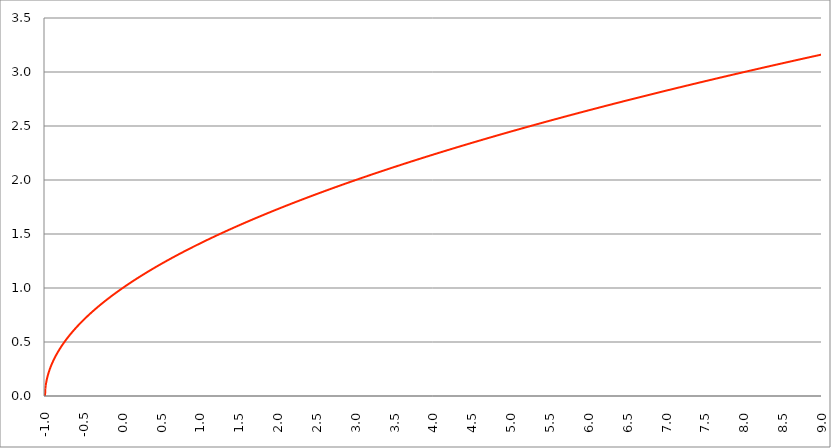
| Category | Series 1 |
|---|---|
| -1.0 | 0 |
| -0.995 | 0.071 |
| -0.99 | 0.1 |
| -0.985 | 0.122 |
| -0.98 | 0.141 |
| -0.975 | 0.158 |
| -0.97 | 0.173 |
| -0.965 | 0.187 |
| -0.96 | 0.2 |
| -0.955 | 0.212 |
| -0.95 | 0.224 |
| -0.945 | 0.235 |
| -0.94 | 0.245 |
| -0.935 | 0.255 |
| -0.93 | 0.265 |
| -0.925 | 0.274 |
| -0.92 | 0.283 |
| -0.915 | 0.292 |
| -0.91 | 0.3 |
| -0.905 | 0.308 |
| -0.9 | 0.316 |
| -0.895 | 0.324 |
| -0.89 | 0.332 |
| -0.885 | 0.339 |
| -0.88 | 0.346 |
| -0.875 | 0.354 |
| -0.87 | 0.361 |
| -0.865 | 0.367 |
| -0.86 | 0.374 |
| -0.855 | 0.381 |
| -0.85 | 0.387 |
| -0.845 | 0.394 |
| -0.84 | 0.4 |
| -0.835 | 0.406 |
| -0.83 | 0.412 |
| -0.825 | 0.418 |
| -0.82 | 0.424 |
| -0.815 | 0.43 |
| -0.81 | 0.436 |
| -0.805 | 0.442 |
| -0.8 | 0.447 |
| -0.795 | 0.453 |
| -0.79 | 0.458 |
| -0.785 | 0.464 |
| -0.78 | 0.469 |
| -0.775 | 0.474 |
| -0.77 | 0.48 |
| -0.765 | 0.485 |
| -0.76 | 0.49 |
| -0.755 | 0.495 |
| -0.75 | 0.5 |
| -0.745 | 0.505 |
| -0.74 | 0.51 |
| -0.735 | 0.515 |
| -0.73 | 0.52 |
| -0.725 | 0.524 |
| -0.72 | 0.529 |
| -0.715 | 0.534 |
| -0.71 | 0.539 |
| -0.705 | 0.543 |
| -0.7 | 0.548 |
| -0.695 | 0.552 |
| -0.69 | 0.557 |
| -0.685 | 0.561 |
| -0.68 | 0.566 |
| -0.675 | 0.57 |
| -0.67 | 0.574 |
| -0.665 | 0.579 |
| -0.66 | 0.583 |
| -0.655 | 0.587 |
| -0.65 | 0.592 |
| -0.645 | 0.596 |
| -0.64 | 0.6 |
| -0.635 | 0.604 |
| -0.63 | 0.608 |
| -0.625 | 0.612 |
| -0.62 | 0.616 |
| -0.615 | 0.62 |
| -0.61 | 0.624 |
| -0.605 | 0.628 |
| -0.6 | 0.632 |
| -0.595 | 0.636 |
| -0.59 | 0.64 |
| -0.585 | 0.644 |
| -0.58 | 0.648 |
| -0.575 | 0.652 |
| -0.57 | 0.656 |
| -0.565 | 0.66 |
| -0.56 | 0.663 |
| -0.555 | 0.667 |
| -0.55 | 0.671 |
| -0.545 | 0.675 |
| -0.54 | 0.678 |
| -0.535 | 0.682 |
| -0.53 | 0.686 |
| -0.525 | 0.689 |
| -0.52 | 0.693 |
| -0.515 | 0.696 |
| -0.51 | 0.7 |
| -0.505 | 0.704 |
| -0.5 | 0.707 |
| -0.495 | 0.711 |
| -0.49 | 0.714 |
| -0.485 | 0.718 |
| -0.48 | 0.721 |
| -0.475 | 0.725 |
| -0.469999999999999 | 0.728 |
| -0.464999999999999 | 0.731 |
| -0.459999999999999 | 0.735 |
| -0.454999999999999 | 0.738 |
| -0.449999999999999 | 0.742 |
| -0.444999999999999 | 0.745 |
| -0.439999999999999 | 0.748 |
| -0.434999999999999 | 0.752 |
| -0.429999999999999 | 0.755 |
| -0.424999999999999 | 0.758 |
| -0.419999999999999 | 0.762 |
| -0.414999999999999 | 0.765 |
| -0.409999999999999 | 0.768 |
| -0.404999999999999 | 0.771 |
| -0.399999999999999 | 0.775 |
| -0.394999999999999 | 0.778 |
| -0.389999999999999 | 0.781 |
| -0.384999999999999 | 0.784 |
| -0.379999999999999 | 0.787 |
| -0.374999999999999 | 0.791 |
| -0.369999999999999 | 0.794 |
| -0.364999999999999 | 0.797 |
| -0.359999999999999 | 0.8 |
| -0.354999999999999 | 0.803 |
| -0.349999999999999 | 0.806 |
| -0.344999999999999 | 0.809 |
| -0.339999999999999 | 0.812 |
| -0.334999999999999 | 0.815 |
| -0.329999999999999 | 0.819 |
| -0.324999999999999 | 0.822 |
| -0.319999999999999 | 0.825 |
| -0.314999999999999 | 0.828 |
| -0.309999999999999 | 0.831 |
| -0.304999999999999 | 0.834 |
| -0.299999999999999 | 0.837 |
| -0.294999999999999 | 0.84 |
| -0.289999999999999 | 0.843 |
| -0.284999999999999 | 0.846 |
| -0.279999999999999 | 0.849 |
| -0.274999999999999 | 0.851 |
| -0.269999999999999 | 0.854 |
| -0.264999999999999 | 0.857 |
| -0.259999999999999 | 0.86 |
| -0.254999999999999 | 0.863 |
| -0.249999999999999 | 0.866 |
| -0.244999999999999 | 0.869 |
| -0.239999999999999 | 0.872 |
| -0.234999999999999 | 0.875 |
| -0.229999999999999 | 0.877 |
| -0.224999999999999 | 0.88 |
| -0.219999999999999 | 0.883 |
| -0.214999999999999 | 0.886 |
| -0.209999999999999 | 0.889 |
| -0.204999999999999 | 0.892 |
| -0.199999999999999 | 0.894 |
| -0.194999999999999 | 0.897 |
| -0.189999999999999 | 0.9 |
| -0.184999999999999 | 0.903 |
| -0.179999999999999 | 0.906 |
| -0.174999999999999 | 0.908 |
| -0.169999999999999 | 0.911 |
| -0.164999999999999 | 0.914 |
| -0.159999999999999 | 0.917 |
| -0.154999999999999 | 0.919 |
| -0.149999999999999 | 0.922 |
| -0.144999999999999 | 0.925 |
| -0.139999999999999 | 0.927 |
| -0.134999999999999 | 0.93 |
| -0.129999999999999 | 0.933 |
| -0.124999999999999 | 0.935 |
| -0.119999999999999 | 0.938 |
| -0.114999999999999 | 0.941 |
| -0.109999999999999 | 0.943 |
| -0.104999999999999 | 0.946 |
| -0.0999999999999992 | 0.949 |
| -0.0949999999999992 | 0.951 |
| -0.0899999999999992 | 0.954 |
| -0.0849999999999992 | 0.957 |
| -0.0799999999999992 | 0.959 |
| -0.0749999999999992 | 0.962 |
| -0.0699999999999992 | 0.964 |
| -0.0649999999999992 | 0.967 |
| -0.0599999999999992 | 0.97 |
| -0.0549999999999992 | 0.972 |
| -0.0499999999999992 | 0.975 |
| -0.0449999999999992 | 0.977 |
| -0.0399999999999992 | 0.98 |
| -0.0349999999999992 | 0.982 |
| -0.0299999999999992 | 0.985 |
| -0.0249999999999992 | 0.987 |
| -0.0199999999999992 | 0.99 |
| -0.0149999999999992 | 0.992 |
| -0.00999999999999918 | 0.995 |
| -0.00499999999999918 | 0.997 |
| 8.2052420413703e-16 | 1 |
| 0.00500000000000082 | 1.002 |
| 0.0100000000000008 | 1.005 |
| 0.0150000000000008 | 1.007 |
| 0.0200000000000008 | 1.01 |
| 0.0250000000000008 | 1.012 |
| 0.0300000000000008 | 1.015 |
| 0.0350000000000008 | 1.017 |
| 0.0400000000000008 | 1.02 |
| 0.0450000000000008 | 1.022 |
| 0.0500000000000008 | 1.025 |
| 0.0550000000000008 | 1.027 |
| 0.0600000000000008 | 1.03 |
| 0.0650000000000008 | 1.032 |
| 0.0700000000000008 | 1.034 |
| 0.0750000000000008 | 1.037 |
| 0.0800000000000008 | 1.039 |
| 0.0850000000000008 | 1.042 |
| 0.0900000000000008 | 1.044 |
| 0.0950000000000008 | 1.046 |
| 0.100000000000001 | 1.049 |
| 0.105000000000001 | 1.051 |
| 0.110000000000001 | 1.054 |
| 0.115000000000001 | 1.056 |
| 0.120000000000001 | 1.058 |
| 0.125000000000001 | 1.061 |
| 0.130000000000001 | 1.063 |
| 0.135000000000001 | 1.065 |
| 0.140000000000001 | 1.068 |
| 0.145000000000001 | 1.07 |
| 0.150000000000001 | 1.072 |
| 0.155000000000001 | 1.075 |
| 0.160000000000001 | 1.077 |
| 0.165000000000001 | 1.079 |
| 0.170000000000001 | 1.082 |
| 0.175000000000001 | 1.084 |
| 0.180000000000001 | 1.086 |
| 0.185000000000001 | 1.089 |
| 0.190000000000001 | 1.091 |
| 0.195000000000001 | 1.093 |
| 0.200000000000001 | 1.095 |
| 0.205000000000001 | 1.098 |
| 0.210000000000001 | 1.1 |
| 0.215000000000001 | 1.102 |
| 0.220000000000001 | 1.105 |
| 0.225000000000001 | 1.107 |
| 0.230000000000001 | 1.109 |
| 0.235000000000001 | 1.111 |
| 0.240000000000001 | 1.114 |
| 0.245000000000001 | 1.116 |
| 0.250000000000001 | 1.118 |
| 0.255000000000001 | 1.12 |
| 0.260000000000001 | 1.122 |
| 0.265000000000001 | 1.125 |
| 0.270000000000001 | 1.127 |
| 0.275000000000001 | 1.129 |
| 0.280000000000001 | 1.131 |
| 0.285000000000001 | 1.134 |
| 0.290000000000001 | 1.136 |
| 0.295000000000001 | 1.138 |
| 0.300000000000001 | 1.14 |
| 0.305000000000001 | 1.142 |
| 0.310000000000001 | 1.145 |
| 0.315000000000001 | 1.147 |
| 0.320000000000001 | 1.149 |
| 0.325000000000001 | 1.151 |
| 0.330000000000001 | 1.153 |
| 0.335000000000001 | 1.155 |
| 0.340000000000001 | 1.158 |
| 0.345000000000001 | 1.16 |
| 0.350000000000001 | 1.162 |
| 0.355000000000001 | 1.164 |
| 0.360000000000001 | 1.166 |
| 0.365000000000001 | 1.168 |
| 0.370000000000001 | 1.17 |
| 0.375000000000001 | 1.173 |
| 0.380000000000001 | 1.175 |
| 0.385000000000001 | 1.177 |
| 0.390000000000001 | 1.179 |
| 0.395000000000001 | 1.181 |
| 0.400000000000001 | 1.183 |
| 0.405000000000001 | 1.185 |
| 0.410000000000001 | 1.187 |
| 0.415000000000001 | 1.19 |
| 0.420000000000001 | 1.192 |
| 0.425000000000001 | 1.194 |
| 0.430000000000001 | 1.196 |
| 0.435000000000001 | 1.198 |
| 0.440000000000001 | 1.2 |
| 0.445000000000001 | 1.202 |
| 0.450000000000001 | 1.204 |
| 0.455000000000001 | 1.206 |
| 0.460000000000001 | 1.208 |
| 0.465000000000001 | 1.21 |
| 0.470000000000001 | 1.212 |
| 0.475000000000001 | 1.214 |
| 0.480000000000001 | 1.217 |
| 0.485000000000001 | 1.219 |
| 0.490000000000001 | 1.221 |
| 0.495000000000001 | 1.223 |
| 0.500000000000001 | 1.225 |
| 0.505000000000001 | 1.227 |
| 0.510000000000001 | 1.229 |
| 0.515000000000001 | 1.231 |
| 0.520000000000001 | 1.233 |
| 0.525000000000001 | 1.235 |
| 0.530000000000001 | 1.237 |
| 0.535000000000001 | 1.239 |
| 0.540000000000001 | 1.241 |
| 0.545000000000001 | 1.243 |
| 0.550000000000001 | 1.245 |
| 0.555000000000001 | 1.247 |
| 0.560000000000001 | 1.249 |
| 0.565000000000001 | 1.251 |
| 0.570000000000001 | 1.253 |
| 0.575000000000001 | 1.255 |
| 0.580000000000001 | 1.257 |
| 0.585000000000001 | 1.259 |
| 0.590000000000001 | 1.261 |
| 0.595000000000001 | 1.263 |
| 0.600000000000001 | 1.265 |
| 0.605000000000001 | 1.267 |
| 0.610000000000001 | 1.269 |
| 0.615000000000001 | 1.271 |
| 0.620000000000001 | 1.273 |
| 0.625000000000001 | 1.275 |
| 0.630000000000001 | 1.277 |
| 0.635000000000001 | 1.279 |
| 0.640000000000001 | 1.281 |
| 0.645000000000001 | 1.283 |
| 0.650000000000001 | 1.285 |
| 0.655000000000001 | 1.286 |
| 0.660000000000001 | 1.288 |
| 0.665000000000001 | 1.29 |
| 0.670000000000001 | 1.292 |
| 0.675000000000001 | 1.294 |
| 0.680000000000001 | 1.296 |
| 0.685000000000001 | 1.298 |
| 0.690000000000001 | 1.3 |
| 0.695000000000001 | 1.302 |
| 0.700000000000001 | 1.304 |
| 0.705000000000001 | 1.306 |
| 0.710000000000001 | 1.308 |
| 0.715000000000001 | 1.31 |
| 0.720000000000001 | 1.311 |
| 0.725000000000001 | 1.313 |
| 0.730000000000001 | 1.315 |
| 0.735000000000001 | 1.317 |
| 0.740000000000001 | 1.319 |
| 0.745000000000001 | 1.321 |
| 0.750000000000001 | 1.323 |
| 0.755000000000001 | 1.325 |
| 0.760000000000001 | 1.327 |
| 0.765000000000001 | 1.329 |
| 0.770000000000001 | 1.33 |
| 0.775000000000001 | 1.332 |
| 0.780000000000001 | 1.334 |
| 0.785000000000001 | 1.336 |
| 0.790000000000001 | 1.338 |
| 0.795000000000001 | 1.34 |
| 0.800000000000001 | 1.342 |
| 0.805000000000001 | 1.344 |
| 0.810000000000001 | 1.345 |
| 0.815000000000001 | 1.347 |
| 0.820000000000001 | 1.349 |
| 0.825000000000001 | 1.351 |
| 0.830000000000001 | 1.353 |
| 0.835000000000001 | 1.355 |
| 0.840000000000001 | 1.356 |
| 0.845000000000001 | 1.358 |
| 0.850000000000001 | 1.36 |
| 0.855000000000001 | 1.362 |
| 0.860000000000001 | 1.364 |
| 0.865000000000001 | 1.366 |
| 0.870000000000001 | 1.367 |
| 0.875000000000001 | 1.369 |
| 0.880000000000001 | 1.371 |
| 0.885000000000001 | 1.373 |
| 0.890000000000001 | 1.375 |
| 0.895000000000001 | 1.377 |
| 0.900000000000001 | 1.378 |
| 0.905000000000001 | 1.38 |
| 0.910000000000001 | 1.382 |
| 0.915000000000001 | 1.384 |
| 0.920000000000001 | 1.386 |
| 0.925000000000001 | 1.387 |
| 0.930000000000001 | 1.389 |
| 0.935000000000001 | 1.391 |
| 0.940000000000001 | 1.393 |
| 0.945000000000001 | 1.395 |
| 0.950000000000001 | 1.396 |
| 0.955000000000001 | 1.398 |
| 0.960000000000001 | 1.4 |
| 0.965000000000001 | 1.402 |
| 0.970000000000001 | 1.404 |
| 0.975000000000002 | 1.405 |
| 0.980000000000001 | 1.407 |
| 0.985000000000002 | 1.409 |
| 0.990000000000001 | 1.411 |
| 0.995000000000002 | 1.412 |
| 1.000000000000002 | 1.414 |
| 1.005000000000001 | 1.416 |
| 1.010000000000001 | 1.418 |
| 1.015000000000001 | 1.42 |
| 1.020000000000001 | 1.421 |
| 1.025000000000001 | 1.423 |
| 1.030000000000001 | 1.425 |
| 1.035000000000001 | 1.427 |
| 1.040000000000001 | 1.428 |
| 1.045000000000001 | 1.43 |
| 1.05 | 1.432 |
| 1.055 | 1.434 |
| 1.06 | 1.435 |
| 1.065 | 1.437 |
| 1.07 | 1.439 |
| 1.075 | 1.44 |
| 1.08 | 1.442 |
| 1.085 | 1.444 |
| 1.09 | 1.446 |
| 1.095 | 1.447 |
| 1.099999999999999 | 1.449 |
| 1.104999999999999 | 1.451 |
| 1.109999999999999 | 1.453 |
| 1.114999999999999 | 1.454 |
| 1.119999999999999 | 1.456 |
| 1.124999999999999 | 1.458 |
| 1.129999999999999 | 1.459 |
| 1.134999999999999 | 1.461 |
| 1.139999999999999 | 1.463 |
| 1.144999999999998 | 1.465 |
| 1.149999999999998 | 1.466 |
| 1.154999999999998 | 1.468 |
| 1.159999999999998 | 1.47 |
| 1.164999999999998 | 1.471 |
| 1.169999999999998 | 1.473 |
| 1.174999999999998 | 1.475 |
| 1.179999999999998 | 1.476 |
| 1.184999999999998 | 1.478 |
| 1.189999999999997 | 1.48 |
| 1.194999999999997 | 1.482 |
| 1.199999999999997 | 1.483 |
| 1.204999999999997 | 1.485 |
| 1.209999999999997 | 1.487 |
| 1.214999999999997 | 1.488 |
| 1.219999999999997 | 1.49 |
| 1.224999999999997 | 1.492 |
| 1.229999999999997 | 1.493 |
| 1.234999999999997 | 1.495 |
| 1.239999999999996 | 1.497 |
| 1.244999999999996 | 1.498 |
| 1.249999999999996 | 1.5 |
| 1.254999999999996 | 1.502 |
| 1.259999999999996 | 1.503 |
| 1.264999999999996 | 1.505 |
| 1.269999999999996 | 1.507 |
| 1.274999999999996 | 1.508 |
| 1.279999999999996 | 1.51 |
| 1.284999999999995 | 1.512 |
| 1.289999999999995 | 1.513 |
| 1.294999999999995 | 1.515 |
| 1.299999999999995 | 1.517 |
| 1.304999999999995 | 1.518 |
| 1.309999999999995 | 1.52 |
| 1.314999999999995 | 1.522 |
| 1.319999999999995 | 1.523 |
| 1.324999999999995 | 1.525 |
| 1.329999999999994 | 1.526 |
| 1.334999999999994 | 1.528 |
| 1.339999999999994 | 1.53 |
| 1.344999999999994 | 1.531 |
| 1.349999999999994 | 1.533 |
| 1.354999999999994 | 1.535 |
| 1.359999999999994 | 1.536 |
| 1.364999999999994 | 1.538 |
| 1.369999999999994 | 1.539 |
| 1.374999999999994 | 1.541 |
| 1.379999999999993 | 1.543 |
| 1.384999999999993 | 1.544 |
| 1.389999999999993 | 1.546 |
| 1.394999999999993 | 1.548 |
| 1.399999999999993 | 1.549 |
| 1.404999999999993 | 1.551 |
| 1.409999999999993 | 1.552 |
| 1.414999999999993 | 1.554 |
| 1.419999999999993 | 1.556 |
| 1.424999999999992 | 1.557 |
| 1.429999999999992 | 1.559 |
| 1.434999999999992 | 1.56 |
| 1.439999999999992 | 1.562 |
| 1.444999999999992 | 1.564 |
| 1.449999999999992 | 1.565 |
| 1.454999999999992 | 1.567 |
| 1.459999999999992 | 1.568 |
| 1.464999999999992 | 1.57 |
| 1.469999999999991 | 1.572 |
| 1.474999999999991 | 1.573 |
| 1.479999999999991 | 1.575 |
| 1.484999999999991 | 1.576 |
| 1.489999999999991 | 1.578 |
| 1.494999999999991 | 1.58 |
| 1.499999999999991 | 1.581 |
| 1.504999999999991 | 1.583 |
| 1.509999999999991 | 1.584 |
| 1.514999999999991 | 1.586 |
| 1.51999999999999 | 1.587 |
| 1.52499999999999 | 1.589 |
| 1.52999999999999 | 1.591 |
| 1.53499999999999 | 1.592 |
| 1.53999999999999 | 1.594 |
| 1.54499999999999 | 1.595 |
| 1.54999999999999 | 1.597 |
| 1.55499999999999 | 1.598 |
| 1.55999999999999 | 1.6 |
| 1.564999999999989 | 1.602 |
| 1.569999999999989 | 1.603 |
| 1.574999999999989 | 1.605 |
| 1.579999999999989 | 1.606 |
| 1.584999999999989 | 1.608 |
| 1.589999999999989 | 1.609 |
| 1.594999999999989 | 1.611 |
| 1.599999999999989 | 1.612 |
| 1.604999999999989 | 1.614 |
| 1.609999999999988 | 1.616 |
| 1.614999999999988 | 1.617 |
| 1.619999999999988 | 1.619 |
| 1.624999999999988 | 1.62 |
| 1.629999999999988 | 1.622 |
| 1.634999999999988 | 1.623 |
| 1.639999999999988 | 1.625 |
| 1.644999999999988 | 1.626 |
| 1.649999999999988 | 1.628 |
| 1.654999999999987 | 1.629 |
| 1.659999999999987 | 1.631 |
| 1.664999999999987 | 1.632 |
| 1.669999999999987 | 1.634 |
| 1.674999999999987 | 1.636 |
| 1.679999999999987 | 1.637 |
| 1.684999999999987 | 1.639 |
| 1.689999999999987 | 1.64 |
| 1.694999999999987 | 1.642 |
| 1.699999999999987 | 1.643 |
| 1.704999999999986 | 1.645 |
| 1.709999999999986 | 1.646 |
| 1.714999999999986 | 1.648 |
| 1.719999999999986 | 1.649 |
| 1.724999999999986 | 1.651 |
| 1.729999999999986 | 1.652 |
| 1.734999999999986 | 1.654 |
| 1.739999999999986 | 1.655 |
| 1.744999999999986 | 1.657 |
| 1.749999999999985 | 1.658 |
| 1.754999999999985 | 1.66 |
| 1.759999999999985 | 1.661 |
| 1.764999999999985 | 1.663 |
| 1.769999999999985 | 1.664 |
| 1.774999999999985 | 1.666 |
| 1.779999999999985 | 1.667 |
| 1.784999999999985 | 1.669 |
| 1.789999999999985 | 1.67 |
| 1.794999999999985 | 1.672 |
| 1.799999999999984 | 1.673 |
| 1.804999999999984 | 1.675 |
| 1.809999999999984 | 1.676 |
| 1.814999999999984 | 1.678 |
| 1.819999999999984 | 1.679 |
| 1.824999999999984 | 1.681 |
| 1.829999999999984 | 1.682 |
| 1.834999999999984 | 1.684 |
| 1.839999999999984 | 1.685 |
| 1.844999999999983 | 1.687 |
| 1.849999999999983 | 1.688 |
| 1.854999999999983 | 1.69 |
| 1.859999999999983 | 1.691 |
| 1.864999999999983 | 1.693 |
| 1.869999999999983 | 1.694 |
| 1.874999999999983 | 1.696 |
| 1.879999999999983 | 1.697 |
| 1.884999999999983 | 1.699 |
| 1.889999999999983 | 1.7 |
| 1.894999999999982 | 1.701 |
| 1.899999999999982 | 1.703 |
| 1.904999999999982 | 1.704 |
| 1.909999999999982 | 1.706 |
| 1.914999999999982 | 1.707 |
| 1.919999999999982 | 1.709 |
| 1.924999999999982 | 1.71 |
| 1.929999999999982 | 1.712 |
| 1.934999999999982 | 1.713 |
| 1.939999999999981 | 1.715 |
| 1.944999999999981 | 1.716 |
| 1.949999999999981 | 1.718 |
| 1.954999999999981 | 1.719 |
| 1.959999999999981 | 1.72 |
| 1.964999999999981 | 1.722 |
| 1.969999999999981 | 1.723 |
| 1.974999999999981 | 1.725 |
| 1.979999999999981 | 1.726 |
| 1.984999999999981 | 1.728 |
| 1.98999999999998 | 1.729 |
| 1.99499999999998 | 1.731 |
| 1.99999999999998 | 1.732 |
| 2.00499999999998 | 1.733 |
| 2.00999999999998 | 1.735 |
| 2.01499999999998 | 1.736 |
| 2.01999999999998 | 1.738 |
| 2.02499999999998 | 1.739 |
| 2.02999999999998 | 1.741 |
| 2.03499999999998 | 1.742 |
| 2.03999999999998 | 1.744 |
| 2.044999999999979 | 1.745 |
| 2.049999999999979 | 1.746 |
| 2.054999999999979 | 1.748 |
| 2.059999999999979 | 1.749 |
| 2.06499999999998 | 1.751 |
| 2.069999999999979 | 1.752 |
| 2.074999999999979 | 1.754 |
| 2.079999999999979 | 1.755 |
| 2.084999999999979 | 1.756 |
| 2.089999999999979 | 1.758 |
| 2.094999999999978 | 1.759 |
| 2.099999999999978 | 1.761 |
| 2.104999999999978 | 1.762 |
| 2.109999999999978 | 1.764 |
| 2.114999999999978 | 1.765 |
| 2.119999999999978 | 1.766 |
| 2.124999999999978 | 1.768 |
| 2.129999999999978 | 1.769 |
| 2.134999999999978 | 1.771 |
| 2.139999999999977 | 1.772 |
| 2.144999999999977 | 1.773 |
| 2.149999999999977 | 1.775 |
| 2.154999999999977 | 1.776 |
| 2.159999999999977 | 1.778 |
| 2.164999999999977 | 1.779 |
| 2.169999999999977 | 1.78 |
| 2.174999999999977 | 1.782 |
| 2.179999999999977 | 1.783 |
| 2.184999999999976 | 1.785 |
| 2.189999999999976 | 1.786 |
| 2.194999999999976 | 1.787 |
| 2.199999999999976 | 1.789 |
| 2.204999999999976 | 1.79 |
| 2.209999999999976 | 1.792 |
| 2.214999999999976 | 1.793 |
| 2.219999999999976 | 1.794 |
| 2.224999999999976 | 1.796 |
| 2.229999999999976 | 1.797 |
| 2.234999999999975 | 1.799 |
| 2.239999999999975 | 1.8 |
| 2.244999999999975 | 1.801 |
| 2.249999999999975 | 1.803 |
| 2.254999999999975 | 1.804 |
| 2.259999999999975 | 1.806 |
| 2.264999999999975 | 1.807 |
| 2.269999999999975 | 1.808 |
| 2.274999999999975 | 1.81 |
| 2.279999999999974 | 1.811 |
| 2.284999999999974 | 1.812 |
| 2.289999999999974 | 1.814 |
| 2.294999999999974 | 1.815 |
| 2.299999999999974 | 1.817 |
| 2.304999999999974 | 1.818 |
| 2.309999999999974 | 1.819 |
| 2.314999999999974 | 1.821 |
| 2.319999999999974 | 1.822 |
| 2.324999999999973 | 1.823 |
| 2.329999999999973 | 1.825 |
| 2.334999999999973 | 1.826 |
| 2.339999999999973 | 1.828 |
| 2.344999999999973 | 1.829 |
| 2.349999999999973 | 1.83 |
| 2.354999999999973 | 1.832 |
| 2.359999999999973 | 1.833 |
| 2.364999999999973 | 1.834 |
| 2.369999999999973 | 1.836 |
| 2.374999999999972 | 1.837 |
| 2.379999999999972 | 1.838 |
| 2.384999999999972 | 1.84 |
| 2.389999999999972 | 1.841 |
| 2.394999999999972 | 1.843 |
| 2.399999999999972 | 1.844 |
| 2.404999999999972 | 1.845 |
| 2.409999999999972 | 1.847 |
| 2.414999999999972 | 1.848 |
| 2.419999999999971 | 1.849 |
| 2.424999999999971 | 1.851 |
| 2.429999999999971 | 1.852 |
| 2.434999999999971 | 1.853 |
| 2.439999999999971 | 1.855 |
| 2.444999999999971 | 1.856 |
| 2.449999999999971 | 1.857 |
| 2.454999999999971 | 1.859 |
| 2.459999999999971 | 1.86 |
| 2.464999999999971 | 1.861 |
| 2.46999999999997 | 1.863 |
| 2.47499999999997 | 1.864 |
| 2.47999999999997 | 1.865 |
| 2.48499999999997 | 1.867 |
| 2.48999999999997 | 1.868 |
| 2.49499999999997 | 1.869 |
| 2.49999999999997 | 1.871 |
| 2.50499999999997 | 1.872 |
| 2.50999999999997 | 1.873 |
| 2.514999999999969 | 1.875 |
| 2.519999999999969 | 1.876 |
| 2.524999999999969 | 1.877 |
| 2.529999999999969 | 1.879 |
| 2.534999999999969 | 1.88 |
| 2.539999999999969 | 1.881 |
| 2.544999999999969 | 1.883 |
| 2.549999999999969 | 1.884 |
| 2.554999999999969 | 1.885 |
| 2.559999999999969 | 1.887 |
| 2.564999999999968 | 1.888 |
| 2.569999999999968 | 1.889 |
| 2.574999999999968 | 1.891 |
| 2.579999999999968 | 1.892 |
| 2.584999999999968 | 1.893 |
| 2.589999999999968 | 1.895 |
| 2.594999999999968 | 1.896 |
| 2.599999999999968 | 1.897 |
| 2.604999999999967 | 1.899 |
| 2.609999999999967 | 1.9 |
| 2.614999999999967 | 1.901 |
| 2.619999999999967 | 1.903 |
| 2.624999999999967 | 1.904 |
| 2.629999999999967 | 1.905 |
| 2.634999999999967 | 1.907 |
| 2.639999999999967 | 1.908 |
| 2.644999999999967 | 1.909 |
| 2.649999999999967 | 1.91 |
| 2.654999999999966 | 1.912 |
| 2.659999999999966 | 1.913 |
| 2.664999999999966 | 1.914 |
| 2.669999999999966 | 1.916 |
| 2.674999999999966 | 1.917 |
| 2.679999999999966 | 1.918 |
| 2.684999999999966 | 1.92 |
| 2.689999999999966 | 1.921 |
| 2.694999999999966 | 1.922 |
| 2.699999999999965 | 1.924 |
| 2.704999999999965 | 1.925 |
| 2.709999999999965 | 1.926 |
| 2.714999999999965 | 1.927 |
| 2.719999999999965 | 1.929 |
| 2.724999999999965 | 1.93 |
| 2.729999999999965 | 1.931 |
| 2.734999999999965 | 1.933 |
| 2.739999999999965 | 1.934 |
| 2.744999999999965 | 1.935 |
| 2.749999999999964 | 1.936 |
| 2.754999999999964 | 1.938 |
| 2.759999999999964 | 1.939 |
| 2.764999999999964 | 1.94 |
| 2.769999999999964 | 1.942 |
| 2.774999999999964 | 1.943 |
| 2.779999999999964 | 1.944 |
| 2.784999999999964 | 1.946 |
| 2.789999999999964 | 1.947 |
| 2.794999999999963 | 1.948 |
| 2.799999999999963 | 1.949 |
| 2.804999999999963 | 1.951 |
| 2.809999999999963 | 1.952 |
| 2.814999999999963 | 1.953 |
| 2.819999999999963 | 1.954 |
| 2.824999999999963 | 1.956 |
| 2.829999999999963 | 1.957 |
| 2.834999999999963 | 1.958 |
| 2.839999999999963 | 1.96 |
| 2.844999999999962 | 1.961 |
| 2.849999999999962 | 1.962 |
| 2.854999999999962 | 1.963 |
| 2.859999999999962 | 1.965 |
| 2.864999999999962 | 1.966 |
| 2.869999999999962 | 1.967 |
| 2.874999999999962 | 1.969 |
| 2.879999999999962 | 1.97 |
| 2.884999999999962 | 1.971 |
| 2.889999999999961 | 1.972 |
| 2.894999999999961 | 1.974 |
| 2.899999999999961 | 1.975 |
| 2.904999999999961 | 1.976 |
| 2.909999999999961 | 1.977 |
| 2.914999999999961 | 1.979 |
| 2.919999999999961 | 1.98 |
| 2.924999999999961 | 1.981 |
| 2.929999999999961 | 1.982 |
| 2.934999999999961 | 1.984 |
| 2.93999999999996 | 1.985 |
| 2.94499999999996 | 1.986 |
| 2.94999999999996 | 1.987 |
| 2.95499999999996 | 1.989 |
| 2.95999999999996 | 1.99 |
| 2.96499999999996 | 1.991 |
| 2.96999999999996 | 1.992 |
| 2.97499999999996 | 1.994 |
| 2.97999999999996 | 1.995 |
| 2.984999999999959 | 1.996 |
| 2.989999999999959 | 1.997 |
| 2.994999999999959 | 1.999 |
| 2.999999999999959 | 2 |
| 3.00499999999996 | 2.001 |
| 3.009999999999959 | 2.002 |
| 3.014999999999959 | 2.004 |
| 3.019999999999959 | 2.005 |
| 3.024999999999959 | 2.006 |
| 3.029999999999958 | 2.007 |
| 3.034999999999958 | 2.009 |
| 3.039999999999958 | 2.01 |
| 3.044999999999958 | 2.011 |
| 3.049999999999958 | 2.012 |
| 3.054999999999958 | 2.014 |
| 3.059999999999958 | 2.015 |
| 3.064999999999958 | 2.016 |
| 3.069999999999958 | 2.017 |
| 3.074999999999958 | 2.019 |
| 3.079999999999957 | 2.02 |
| 3.084999999999957 | 2.021 |
| 3.089999999999957 | 2.022 |
| 3.094999999999957 | 2.024 |
| 3.099999999999957 | 2.025 |
| 3.104999999999957 | 2.026 |
| 3.109999999999957 | 2.027 |
| 3.114999999999957 | 2.029 |
| 3.119999999999957 | 2.03 |
| 3.124999999999956 | 2.031 |
| 3.129999999999956 | 2.032 |
| 3.134999999999956 | 2.033 |
| 3.139999999999956 | 2.035 |
| 3.144999999999956 | 2.036 |
| 3.149999999999956 | 2.037 |
| 3.154999999999956 | 2.038 |
| 3.159999999999956 | 2.04 |
| 3.164999999999956 | 2.041 |
| 3.169999999999955 | 2.042 |
| 3.174999999999955 | 2.043 |
| 3.179999999999955 | 2.045 |
| 3.184999999999955 | 2.046 |
| 3.189999999999955 | 2.047 |
| 3.194999999999955 | 2.048 |
| 3.199999999999955 | 2.049 |
| 3.204999999999955 | 2.051 |
| 3.209999999999955 | 2.052 |
| 3.214999999999955 | 2.053 |
| 3.219999999999954 | 2.054 |
| 3.224999999999954 | 2.055 |
| 3.229999999999954 | 2.057 |
| 3.234999999999954 | 2.058 |
| 3.239999999999954 | 2.059 |
| 3.244999999999954 | 2.06 |
| 3.249999999999954 | 2.062 |
| 3.254999999999954 | 2.063 |
| 3.259999999999954 | 2.064 |
| 3.264999999999953 | 2.065 |
| 3.269999999999953 | 2.066 |
| 3.274999999999953 | 2.068 |
| 3.279999999999953 | 2.069 |
| 3.284999999999953 | 2.07 |
| 3.289999999999953 | 2.071 |
| 3.294999999999953 | 2.072 |
| 3.299999999999953 | 2.074 |
| 3.304999999999953 | 2.075 |
| 3.309999999999952 | 2.076 |
| 3.314999999999952 | 2.077 |
| 3.319999999999952 | 2.078 |
| 3.324999999999952 | 2.08 |
| 3.329999999999952 | 2.081 |
| 3.334999999999952 | 2.082 |
| 3.339999999999952 | 2.083 |
| 3.344999999999952 | 2.084 |
| 3.349999999999952 | 2.086 |
| 3.354999999999952 | 2.087 |
| 3.359999999999951 | 2.088 |
| 3.364999999999951 | 2.089 |
| 3.369999999999951 | 2.09 |
| 3.374999999999951 | 2.092 |
| 3.379999999999951 | 2.093 |
| 3.384999999999951 | 2.094 |
| 3.389999999999951 | 2.095 |
| 3.394999999999951 | 2.096 |
| 3.399999999999951 | 2.098 |
| 3.40499999999995 | 2.099 |
| 3.40999999999995 | 2.1 |
| 3.41499999999995 | 2.101 |
| 3.41999999999995 | 2.102 |
| 3.42499999999995 | 2.104 |
| 3.42999999999995 | 2.105 |
| 3.43499999999995 | 2.106 |
| 3.43999999999995 | 2.107 |
| 3.44499999999995 | 2.108 |
| 3.44999999999995 | 2.11 |
| 3.454999999999949 | 2.111 |
| 3.459999999999949 | 2.112 |
| 3.464999999999949 | 2.113 |
| 3.469999999999949 | 2.114 |
| 3.474999999999949 | 2.115 |
| 3.479999999999949 | 2.117 |
| 3.484999999999949 | 2.118 |
| 3.489999999999949 | 2.119 |
| 3.494999999999949 | 2.12 |
| 3.499999999999948 | 2.121 |
| 3.504999999999948 | 2.122 |
| 3.509999999999948 | 2.124 |
| 3.514999999999948 | 2.125 |
| 3.519999999999948 | 2.126 |
| 3.524999999999948 | 2.127 |
| 3.529999999999948 | 2.128 |
| 3.534999999999948 | 2.13 |
| 3.539999999999948 | 2.131 |
| 3.544999999999948 | 2.132 |
| 3.549999999999947 | 2.133 |
| 3.554999999999947 | 2.134 |
| 3.559999999999947 | 2.135 |
| 3.564999999999947 | 2.137 |
| 3.569999999999947 | 2.138 |
| 3.574999999999947 | 2.139 |
| 3.579999999999947 | 2.14 |
| 3.584999999999947 | 2.141 |
| 3.589999999999947 | 2.142 |
| 3.594999999999946 | 2.144 |
| 3.599999999999946 | 2.145 |
| 3.604999999999946 | 2.146 |
| 3.609999999999946 | 2.147 |
| 3.614999999999946 | 2.148 |
| 3.619999999999946 | 2.149 |
| 3.624999999999946 | 2.151 |
| 3.629999999999946 | 2.152 |
| 3.634999999999946 | 2.153 |
| 3.639999999999945 | 2.154 |
| 3.644999999999945 | 2.155 |
| 3.649999999999945 | 2.156 |
| 3.654999999999945 | 2.158 |
| 3.659999999999945 | 2.159 |
| 3.664999999999945 | 2.16 |
| 3.669999999999945 | 2.161 |
| 3.674999999999945 | 2.162 |
| 3.679999999999945 | 2.163 |
| 3.684999999999944 | 2.164 |
| 3.689999999999944 | 2.166 |
| 3.694999999999944 | 2.167 |
| 3.699999999999944 | 2.168 |
| 3.704999999999944 | 2.169 |
| 3.709999999999944 | 2.17 |
| 3.714999999999944 | 2.171 |
| 3.719999999999944 | 2.173 |
| 3.724999999999944 | 2.174 |
| 3.729999999999944 | 2.175 |
| 3.734999999999943 | 2.176 |
| 3.739999999999943 | 2.177 |
| 3.744999999999943 | 2.178 |
| 3.749999999999943 | 2.179 |
| 3.754999999999943 | 2.181 |
| 3.759999999999943 | 2.182 |
| 3.764999999999943 | 2.183 |
| 3.769999999999943 | 2.184 |
| 3.774999999999943 | 2.185 |
| 3.779999999999942 | 2.186 |
| 3.784999999999942 | 2.187 |
| 3.789999999999942 | 2.189 |
| 3.794999999999942 | 2.19 |
| 3.799999999999942 | 2.191 |
| 3.804999999999942 | 2.192 |
| 3.809999999999942 | 2.193 |
| 3.814999999999942 | 2.194 |
| 3.819999999999942 | 2.195 |
| 3.824999999999942 | 2.197 |
| 3.829999999999941 | 2.198 |
| 3.834999999999941 | 2.199 |
| 3.839999999999941 | 2.2 |
| 3.844999999999941 | 2.201 |
| 3.849999999999941 | 2.202 |
| 3.854999999999941 | 2.203 |
| 3.859999999999941 | 2.205 |
| 3.864999999999941 | 2.206 |
| 3.869999999999941 | 2.207 |
| 3.87499999999994 | 2.208 |
| 3.87999999999994 | 2.209 |
| 3.88499999999994 | 2.21 |
| 3.88999999999994 | 2.211 |
| 3.89499999999994 | 2.212 |
| 3.89999999999994 | 2.214 |
| 3.90499999999994 | 2.215 |
| 3.90999999999994 | 2.216 |
| 3.91499999999994 | 2.217 |
| 3.91999999999994 | 2.218 |
| 3.924999999999939 | 2.219 |
| 3.929999999999939 | 2.22 |
| 3.934999999999939 | 2.221 |
| 3.939999999999939 | 2.223 |
| 3.944999999999939 | 2.224 |
| 3.949999999999939 | 2.225 |
| 3.954999999999939 | 2.226 |
| 3.959999999999939 | 2.227 |
| 3.964999999999939 | 2.228 |
| 3.969999999999938 | 2.229 |
| 3.974999999999938 | 2.23 |
| 3.979999999999938 | 2.232 |
| 3.984999999999938 | 2.233 |
| 3.989999999999938 | 2.234 |
| 3.994999999999938 | 2.235 |
| 3.999999999999938 | 2.236 |
| 4.004999999999938 | 2.237 |
| 4.009999999999937 | 2.238 |
| 4.014999999999938 | 2.239 |
| 4.019999999999937 | 2.241 |
| 4.024999999999937 | 2.242 |
| 4.029999999999937 | 2.243 |
| 4.034999999999937 | 2.244 |
| 4.039999999999936 | 2.245 |
| 4.044999999999937 | 2.246 |
| 4.049999999999936 | 2.247 |
| 4.054999999999937 | 2.248 |
| 4.059999999999936 | 2.249 |
| 4.064999999999936 | 2.251 |
| 4.069999999999936 | 2.252 |
| 4.074999999999936 | 2.253 |
| 4.079999999999936 | 2.254 |
| 4.084999999999936 | 2.255 |
| 4.089999999999935 | 2.256 |
| 4.094999999999936 | 2.257 |
| 4.099999999999935 | 2.258 |
| 4.104999999999936 | 2.259 |
| 4.109999999999935 | 2.261 |
| 4.114999999999935 | 2.262 |
| 4.119999999999935 | 2.263 |
| 4.124999999999935 | 2.264 |
| 4.129999999999935 | 2.265 |
| 4.134999999999935 | 2.266 |
| 4.139999999999934 | 2.267 |
| 4.144999999999935 | 2.268 |
| 4.149999999999934 | 2.269 |
| 4.154999999999935 | 2.27 |
| 4.159999999999934 | 2.272 |
| 4.164999999999934 | 2.273 |
| 4.169999999999934 | 2.274 |
| 4.174999999999934 | 2.275 |
| 4.179999999999934 | 2.276 |
| 4.184999999999934 | 2.277 |
| 4.189999999999934 | 2.278 |
| 4.194999999999934 | 2.279 |
| 4.199999999999934 | 2.28 |
| 4.204999999999933 | 2.281 |
| 4.209999999999933 | 2.283 |
| 4.214999999999933 | 2.284 |
| 4.219999999999933 | 2.285 |
| 4.224999999999933 | 2.286 |
| 4.229999999999933 | 2.287 |
| 4.234999999999933 | 2.288 |
| 4.239999999999932 | 2.289 |
| 4.244999999999933 | 2.29 |
| 4.249999999999932 | 2.291 |
| 4.254999999999932 | 2.292 |
| 4.259999999999932 | 2.293 |
| 4.264999999999932 | 2.295 |
| 4.269999999999932 | 2.296 |
| 4.274999999999932 | 2.297 |
| 4.279999999999931 | 2.298 |
| 4.284999999999932 | 2.299 |
| 4.289999999999931 | 2.3 |
| 4.294999999999932 | 2.301 |
| 4.299999999999931 | 2.302 |
| 4.304999999999931 | 2.303 |
| 4.309999999999931 | 2.304 |
| 4.314999999999931 | 2.305 |
| 4.319999999999931 | 2.307 |
| 4.324999999999931 | 2.308 |
| 4.329999999999931 | 2.309 |
| 4.334999999999931 | 2.31 |
| 4.33999999999993 | 2.311 |
| 4.34499999999993 | 2.312 |
| 4.34999999999993 | 2.313 |
| 4.35499999999993 | 2.314 |
| 4.35999999999993 | 2.315 |
| 4.36499999999993 | 2.316 |
| 4.36999999999993 | 2.317 |
| 4.37499999999993 | 2.318 |
| 4.37999999999993 | 2.319 |
| 4.38499999999993 | 2.321 |
| 4.38999999999993 | 2.322 |
| 4.394999999999929 | 2.323 |
| 4.39999999999993 | 2.324 |
| 4.40499999999993 | 2.325 |
| 4.40999999999993 | 2.326 |
| 4.414999999999929 | 2.327 |
| 4.419999999999928 | 2.328 |
| 4.424999999999929 | 2.329 |
| 4.429999999999928 | 2.33 |
| 4.434999999999928 | 2.331 |
| 4.439999999999928 | 2.332 |
| 4.444999999999928 | 2.333 |
| 4.449999999999928 | 2.335 |
| 4.454999999999928 | 2.336 |
| 4.459999999999927 | 2.337 |
| 4.464999999999928 | 2.338 |
| 4.469999999999927 | 2.339 |
| 4.474999999999927 | 2.34 |
| 4.479999999999927 | 2.341 |
| 4.484999999999927 | 2.342 |
| 4.489999999999927 | 2.343 |
| 4.494999999999927 | 2.344 |
| 4.499999999999927 | 2.345 |
| 4.504999999999927 | 2.346 |
| 4.509999999999926 | 2.347 |
| 4.514999999999927 | 2.348 |
| 4.519999999999926 | 2.349 |
| 4.524999999999927 | 2.351 |
| 4.529999999999926 | 2.352 |
| 4.534999999999926 | 2.353 |
| 4.539999999999926 | 2.354 |
| 4.544999999999926 | 2.355 |
| 4.549999999999926 | 2.356 |
| 4.554999999999926 | 2.357 |
| 4.559999999999925 | 2.358 |
| 4.564999999999926 | 2.359 |
| 4.569999999999925 | 2.36 |
| 4.574999999999925 | 2.361 |
| 4.579999999999925 | 2.362 |
| 4.584999999999925 | 2.363 |
| 4.589999999999925 | 2.364 |
| 4.594999999999925 | 2.365 |
| 4.599999999999925 | 2.366 |
| 4.604999999999925 | 2.367 |
| 4.609999999999924 | 2.369 |
| 4.614999999999925 | 2.37 |
| 4.619999999999924 | 2.371 |
| 4.624999999999924 | 2.372 |
| 4.629999999999924 | 2.373 |
| 4.634999999999924 | 2.374 |
| 4.639999999999924 | 2.375 |
| 4.644999999999924 | 2.376 |
| 4.649999999999924 | 2.377 |
| 4.654999999999924 | 2.378 |
| 4.659999999999924 | 2.379 |
| 4.664999999999924 | 2.38 |
| 4.669999999999923 | 2.381 |
| 4.674999999999923 | 2.382 |
| 4.679999999999923 | 2.383 |
| 4.684999999999923 | 2.384 |
| 4.689999999999923 | 2.385 |
| 4.694999999999923 | 2.386 |
| 4.699999999999923 | 2.387 |
| 4.704999999999923 | 2.389 |
| 4.709999999999922 | 2.39 |
| 4.714999999999923 | 2.391 |
| 4.719999999999922 | 2.392 |
| 4.724999999999922 | 2.393 |
| 4.729999999999922 | 2.394 |
| 4.734999999999922 | 2.395 |
| 4.739999999999921 | 2.396 |
| 4.744999999999922 | 2.397 |
| 4.749999999999921 | 2.398 |
| 4.754999999999922 | 2.399 |
| 4.759999999999921 | 2.4 |
| 4.764999999999921 | 2.401 |
| 4.769999999999921 | 2.402 |
| 4.774999999999921 | 2.403 |
| 4.77999999999992 | 2.404 |
| 4.784999999999921 | 2.405 |
| 4.78999999999992 | 2.406 |
| 4.794999999999921 | 2.407 |
| 4.79999999999992 | 2.408 |
| 4.804999999999921 | 2.409 |
| 4.80999999999992 | 2.41 |
| 4.81499999999992 | 2.411 |
| 4.81999999999992 | 2.412 |
| 4.82499999999992 | 2.414 |
| 4.82999999999992 | 2.415 |
| 4.83499999999992 | 2.416 |
| 4.83999999999992 | 2.417 |
| 4.84499999999992 | 2.418 |
| 4.84999999999992 | 2.419 |
| 4.85499999999992 | 2.42 |
| 4.859999999999919 | 2.421 |
| 4.864999999999919 | 2.422 |
| 4.869999999999919 | 2.423 |
| 4.874999999999919 | 2.424 |
| 4.87999999999992 | 2.425 |
| 4.884999999999919 | 2.426 |
| 4.889999999999919 | 2.427 |
| 4.894999999999919 | 2.428 |
| 4.899999999999919 | 2.429 |
| 4.904999999999919 | 2.43 |
| 4.909999999999918 | 2.431 |
| 4.914999999999918 | 2.432 |
| 4.919999999999918 | 2.433 |
| 4.924999999999918 | 2.434 |
| 4.929999999999918 | 2.435 |
| 4.934999999999918 | 2.436 |
| 4.939999999999917 | 2.437 |
| 4.944999999999918 | 2.438 |
| 4.949999999999917 | 2.439 |
| 4.954999999999917 | 2.44 |
| 4.959999999999917 | 2.441 |
| 4.964999999999917 | 2.442 |
| 4.969999999999917 | 2.443 |
| 4.974999999999917 | 2.444 |
| 4.979999999999916 | 2.445 |
| 4.984999999999917 | 2.446 |
| 4.989999999999916 | 2.447 |
| 4.994999999999917 | 2.448 |
| 4.999999999999916 | 2.449 |
| 5.004999999999916 | 2.451 |
| 5.009999999999916 | 2.452 |
| 5.014999999999916 | 2.453 |
| 5.019999999999916 | 2.454 |
| 5.024999999999916 | 2.455 |
| 5.029999999999916 | 2.456 |
| 5.034999999999916 | 2.457 |
| 5.039999999999915 | 2.458 |
| 5.044999999999916 | 2.459 |
| 5.049999999999915 | 2.46 |
| 5.054999999999915 | 2.461 |
| 5.059999999999915 | 2.462 |
| 5.064999999999915 | 2.463 |
| 5.069999999999915 | 2.464 |
| 5.074999999999915 | 2.465 |
| 5.079999999999914 | 2.466 |
| 5.084999999999915 | 2.467 |
| 5.089999999999914 | 2.468 |
| 5.094999999999914 | 2.469 |
| 5.099999999999914 | 2.47 |
| 5.104999999999914 | 2.471 |
| 5.109999999999914 | 2.472 |
| 5.114999999999914 | 2.473 |
| 5.119999999999914 | 2.474 |
| 5.124999999999914 | 2.475 |
| 5.129999999999914 | 2.476 |
| 5.134999999999914 | 2.477 |
| 5.139999999999914 | 2.478 |
| 5.144999999999913 | 2.479 |
| 5.149999999999913 | 2.48 |
| 5.154999999999913 | 2.481 |
| 5.159999999999913 | 2.482 |
| 5.164999999999913 | 2.483 |
| 5.169999999999913 | 2.484 |
| 5.174999999999913 | 2.485 |
| 5.179999999999913 | 2.486 |
| 5.184999999999913 | 2.487 |
| 5.189999999999912 | 2.488 |
| 5.194999999999912 | 2.489 |
| 5.199999999999912 | 2.49 |
| 5.204999999999912 | 2.491 |
| 5.209999999999912 | 2.492 |
| 5.214999999999912 | 2.493 |
| 5.219999999999912 | 2.494 |
| 5.224999999999912 | 2.495 |
| 5.229999999999912 | 2.496 |
| 5.234999999999911 | 2.497 |
| 5.239999999999911 | 2.498 |
| 5.244999999999911 | 2.499 |
| 5.249999999999911 | 2.5 |
| 5.254999999999911 | 2.501 |
| 5.259999999999911 | 2.502 |
| 5.264999999999911 | 2.503 |
| 5.269999999999911 | 2.504 |
| 5.274999999999911 | 2.505 |
| 5.27999999999991 | 2.506 |
| 5.28499999999991 | 2.507 |
| 5.28999999999991 | 2.508 |
| 5.29499999999991 | 2.509 |
| 5.29999999999991 | 2.51 |
| 5.30499999999991 | 2.511 |
| 5.30999999999991 | 2.512 |
| 5.31499999999991 | 2.513 |
| 5.31999999999991 | 2.514 |
| 5.32499999999991 | 2.515 |
| 5.329999999999909 | 2.516 |
| 5.334999999999909 | 2.517 |
| 5.33999999999991 | 2.518 |
| 5.344999999999909 | 2.519 |
| 5.349999999999909 | 2.52 |
| 5.354999999999909 | 2.521 |
| 5.359999999999909 | 2.522 |
| 5.364999999999909 | 2.523 |
| 5.369999999999909 | 2.524 |
| 5.374999999999908 | 2.525 |
| 5.379999999999908 | 2.526 |
| 5.384999999999908 | 2.527 |
| 5.389999999999908 | 2.528 |
| 5.394999999999908 | 2.529 |
| 5.399999999999908 | 2.53 |
| 5.404999999999908 | 2.531 |
| 5.409999999999907 | 2.532 |
| 5.414999999999908 | 2.533 |
| 5.419999999999907 | 2.534 |
| 5.424999999999907 | 2.535 |
| 5.429999999999907 | 2.536 |
| 5.434999999999907 | 2.537 |
| 5.439999999999907 | 2.538 |
| 5.444999999999907 | 2.539 |
| 5.449999999999906 | 2.54 |
| 5.454999999999907 | 2.541 |
| 5.459999999999906 | 2.542 |
| 5.464999999999907 | 2.543 |
| 5.469999999999906 | 2.544 |
| 5.474999999999906 | 2.545 |
| 5.479999999999906 | 2.546 |
| 5.484999999999906 | 2.547 |
| 5.489999999999906 | 2.548 |
| 5.494999999999906 | 2.549 |
| 5.499999999999905 | 2.55 |
| 5.504999999999906 | 2.55 |
| 5.509999999999905 | 2.551 |
| 5.514999999999906 | 2.552 |
| 5.519999999999905 | 2.553 |
| 5.524999999999905 | 2.554 |
| 5.529999999999905 | 2.555 |
| 5.534999999999905 | 2.556 |
| 5.539999999999904 | 2.557 |
| 5.544999999999905 | 2.558 |
| 5.549999999999904 | 2.559 |
| 5.554999999999905 | 2.56 |
| 5.559999999999904 | 2.561 |
| 5.564999999999904 | 2.562 |
| 5.569999999999904 | 2.563 |
| 5.574999999999904 | 2.564 |
| 5.579999999999904 | 2.565 |
| 5.584999999999904 | 2.566 |
| 5.589999999999904 | 2.567 |
| 5.594999999999904 | 2.568 |
| 5.599999999999904 | 2.569 |
| 5.604999999999904 | 2.57 |
| 5.609999999999903 | 2.571 |
| 5.614999999999903 | 2.572 |
| 5.619999999999903 | 2.573 |
| 5.624999999999903 | 2.574 |
| 5.629999999999903 | 2.575 |
| 5.634999999999903 | 2.576 |
| 5.639999999999903 | 2.577 |
| 5.644999999999903 | 2.578 |
| 5.649999999999903 | 2.579 |
| 5.654999999999902 | 2.58 |
| 5.659999999999902 | 2.581 |
| 5.664999999999902 | 2.582 |
| 5.669999999999902 | 2.583 |
| 5.674999999999902 | 2.584 |
| 5.679999999999902 | 2.585 |
| 5.684999999999902 | 2.586 |
| 5.689999999999902 | 2.587 |
| 5.694999999999902 | 2.587 |
| 5.699999999999901 | 2.588 |
| 5.704999999999901 | 2.589 |
| 5.709999999999901 | 2.59 |
| 5.714999999999901 | 2.591 |
| 5.719999999999901 | 2.592 |
| 5.724999999999901 | 2.593 |
| 5.729999999999901 | 2.594 |
| 5.734999999999901 | 2.595 |
| 5.7399999999999 | 2.596 |
| 5.744999999999901 | 2.597 |
| 5.7499999999999 | 2.598 |
| 5.7549999999999 | 2.599 |
| 5.7599999999999 | 2.6 |
| 5.7649999999999 | 2.601 |
| 5.7699999999999 | 2.602 |
| 5.7749999999999 | 2.603 |
| 5.7799999999999 | 2.604 |
| 5.7849999999999 | 2.605 |
| 5.7899999999999 | 2.606 |
| 5.794999999999899 | 2.607 |
| 5.7999999999999 | 2.608 |
| 5.804999999999899 | 2.609 |
| 5.8099999999999 | 2.61 |
| 5.814999999999899 | 2.611 |
| 5.819999999999899 | 2.612 |
| 5.824999999999899 | 2.612 |
| 5.829999999999899 | 2.613 |
| 5.834999999999899 | 2.614 |
| 5.839999999999898 | 2.615 |
| 5.844999999999898 | 2.616 |
| 5.849999999999898 | 2.617 |
| 5.854999999999898 | 2.618 |
| 5.859999999999898 | 2.619 |
| 5.864999999999898 | 2.62 |
| 5.869999999999898 | 2.621 |
| 5.874999999999898 | 2.622 |
| 5.879999999999897 | 2.623 |
| 5.884999999999898 | 2.624 |
| 5.889999999999897 | 2.625 |
| 5.894999999999897 | 2.626 |
| 5.899999999999897 | 2.627 |
| 5.904999999999897 | 2.628 |
| 5.909999999999897 | 2.629 |
| 5.914999999999897 | 2.63 |
| 5.919999999999896 | 2.631 |
| 5.924999999999897 | 2.632 |
| 5.929999999999896 | 2.632 |
| 5.934999999999896 | 2.633 |
| 5.939999999999896 | 2.634 |
| 5.944999999999896 | 2.635 |
| 5.949999999999896 | 2.636 |
| 5.954999999999896 | 2.637 |
| 5.959999999999896 | 2.638 |
| 5.964999999999896 | 2.639 |
| 5.969999999999895 | 2.64 |
| 5.974999999999895 | 2.641 |
| 5.979999999999895 | 2.642 |
| 5.984999999999895 | 2.643 |
| 5.989999999999895 | 2.644 |
| 5.994999999999895 | 2.645 |
| 5.999999999999895 | 2.646 |
| 6.004999999999895 | 2.647 |
| 6.009999999999894 | 2.648 |
| 6.014999999999895 | 2.649 |
| 6.019999999999894 | 2.65 |
| 6.024999999999895 | 2.65 |
| 6.029999999999894 | 2.651 |
| 6.034999999999894 | 2.652 |
| 6.039999999999894 | 2.653 |
| 6.044999999999894 | 2.654 |
| 6.049999999999894 | 2.655 |
| 6.054999999999894 | 2.656 |
| 6.059999999999894 | 2.657 |
| 6.064999999999894 | 2.658 |
| 6.069999999999894 | 2.659 |
| 6.074999999999894 | 2.66 |
| 6.079999999999893 | 2.661 |
| 6.084999999999893 | 2.662 |
| 6.089999999999893 | 2.663 |
| 6.094999999999893 | 2.664 |
| 6.099999999999893 | 2.665 |
| 6.104999999999893 | 2.666 |
| 6.109999999999893 | 2.666 |
| 6.114999999999893 | 2.667 |
| 6.119999999999893 | 2.668 |
| 6.124999999999893 | 2.669 |
| 6.129999999999892 | 2.67 |
| 6.134999999999892 | 2.671 |
| 6.139999999999892 | 2.672 |
| 6.144999999999892 | 2.673 |
| 6.149999999999892 | 2.674 |
| 6.154999999999892 | 2.675 |
| 6.159999999999892 | 2.676 |
| 6.164999999999892 | 2.677 |
| 6.169999999999892 | 2.678 |
| 6.174999999999891 | 2.679 |
| 6.179999999999891 | 2.68 |
| 6.184999999999891 | 2.68 |
| 6.189999999999891 | 2.681 |
| 6.194999999999891 | 2.682 |
| 6.199999999999891 | 2.683 |
| 6.204999999999891 | 2.684 |
| 6.20999999999989 | 2.685 |
| 6.214999999999891 | 2.686 |
| 6.21999999999989 | 2.687 |
| 6.22499999999989 | 2.688 |
| 6.22999999999989 | 2.689 |
| 6.23499999999989 | 2.69 |
| 6.23999999999989 | 2.691 |
| 6.24499999999989 | 2.692 |
| 6.24999999999989 | 2.693 |
| 6.25499999999989 | 2.694 |
| 6.25999999999989 | 2.694 |
| 6.26499999999989 | 2.695 |
| 6.26999999999989 | 2.696 |
| 6.27499999999989 | 2.697 |
| 6.27999999999989 | 2.698 |
| 6.28499999999989 | 2.699 |
| 6.289999999999888 | 2.7 |
| 6.294999999999889 | 2.701 |
| 6.299999999999888 | 2.702 |
| 6.304999999999889 | 2.703 |
| 6.309999999999888 | 2.704 |
| 6.314999999999888 | 2.705 |
| 6.319999999999888 | 2.706 |
| 6.324999999999888 | 2.706 |
| 6.329999999999888 | 2.707 |
| 6.334999999999888 | 2.708 |
| 6.339999999999887 | 2.709 |
| 6.344999999999888 | 2.71 |
| 6.349999999999887 | 2.711 |
| 6.354999999999888 | 2.712 |
| 6.359999999999887 | 2.713 |
| 6.364999999999887 | 2.714 |
| 6.369999999999887 | 2.715 |
| 6.374999999999887 | 2.716 |
| 6.379999999999887 | 2.717 |
| 6.384999999999887 | 2.718 |
| 6.389999999999886 | 2.718 |
| 6.394999999999887 | 2.719 |
| 6.399999999999886 | 2.72 |
| 6.404999999999886 | 2.721 |
| 6.409999999999886 | 2.722 |
| 6.414999999999886 | 2.723 |
| 6.419999999999886 | 2.724 |
| 6.424999999999886 | 2.725 |
| 6.429999999999885 | 2.726 |
| 6.434999999999885 | 2.727 |
| 6.439999999999885 | 2.728 |
| 6.444999999999885 | 2.729 |
| 6.449999999999885 | 2.729 |
| 6.454999999999885 | 2.73 |
| 6.459999999999885 | 2.731 |
| 6.464999999999885 | 2.732 |
| 6.469999999999885 | 2.733 |
| 6.474999999999885 | 2.734 |
| 6.479999999999884 | 2.735 |
| 6.484999999999884 | 2.736 |
| 6.489999999999884 | 2.737 |
| 6.494999999999884 | 2.738 |
| 6.499999999999884 | 2.739 |
| 6.504999999999884 | 2.74 |
| 6.509999999999884 | 2.74 |
| 6.514999999999884 | 2.741 |
| 6.519999999999884 | 2.742 |
| 6.524999999999884 | 2.743 |
| 6.529999999999884 | 2.744 |
| 6.534999999999884 | 2.745 |
| 6.539999999999883 | 2.746 |
| 6.544999999999884 | 2.747 |
| 6.549999999999883 | 2.748 |
| 6.554999999999883 | 2.749 |
| 6.559999999999883 | 2.75 |
| 6.564999999999883 | 2.75 |
| 6.569999999999883 | 2.751 |
| 6.574999999999883 | 2.752 |
| 6.579999999999882 | 2.753 |
| 6.584999999999883 | 2.754 |
| 6.589999999999882 | 2.755 |
| 6.594999999999882 | 2.756 |
| 6.599999999999882 | 2.757 |
| 6.604999999999882 | 2.758 |
| 6.609999999999882 | 2.759 |
| 6.614999999999882 | 2.76 |
| 6.619999999999882 | 2.76 |
| 6.624999999999882 | 2.761 |
| 6.629999999999882 | 2.762 |
| 6.634999999999882 | 2.763 |
| 6.639999999999881 | 2.764 |
| 6.644999999999881 | 2.765 |
| 6.649999999999881 | 2.766 |
| 6.654999999999881 | 2.767 |
| 6.659999999999881 | 2.768 |
| 6.664999999999881 | 2.769 |
| 6.669999999999881 | 2.769 |
| 6.674999999999881 | 2.77 |
| 6.67999999999988 | 2.771 |
| 6.68499999999988 | 2.772 |
| 6.68999999999988 | 2.773 |
| 6.69499999999988 | 2.774 |
| 6.69999999999988 | 2.775 |
| 6.70499999999988 | 2.776 |
| 6.70999999999988 | 2.777 |
| 6.71499999999988 | 2.778 |
| 6.71999999999988 | 2.778 |
| 6.72499999999988 | 2.779 |
| 6.72999999999988 | 2.78 |
| 6.73499999999988 | 2.781 |
| 6.73999999999988 | 2.782 |
| 6.74499999999988 | 2.783 |
| 6.74999999999988 | 2.784 |
| 6.75499999999988 | 2.785 |
| 6.759999999999878 | 2.786 |
| 6.764999999999879 | 2.787 |
| 6.769999999999878 | 2.787 |
| 6.774999999999878 | 2.788 |
| 6.779999999999878 | 2.789 |
| 6.784999999999878 | 2.79 |
| 6.789999999999878 | 2.791 |
| 6.794999999999878 | 2.792 |
| 6.799999999999878 | 2.793 |
| 6.804999999999878 | 2.794 |
| 6.809999999999877 | 2.795 |
| 6.814999999999878 | 2.796 |
| 6.819999999999877 | 2.796 |
| 6.824999999999878 | 2.797 |
| 6.829999999999877 | 2.798 |
| 6.834999999999877 | 2.799 |
| 6.839999999999877 | 2.8 |
| 6.844999999999877 | 2.801 |
| 6.849999999999877 | 2.802 |
| 6.854999999999877 | 2.803 |
| 6.859999999999876 | 2.804 |
| 6.864999999999877 | 2.804 |
| 6.869999999999876 | 2.805 |
| 6.874999999999876 | 2.806 |
| 6.879999999999876 | 2.807 |
| 6.884999999999876 | 2.808 |
| 6.889999999999876 | 2.809 |
| 6.894999999999876 | 2.81 |
| 6.899999999999875 | 2.811 |
| 6.904999999999875 | 2.812 |
| 6.909999999999875 | 2.812 |
| 6.914999999999875 | 2.813 |
| 6.919999999999875 | 2.814 |
| 6.924999999999875 | 2.815 |
| 6.929999999999875 | 2.816 |
| 6.934999999999875 | 2.817 |
| 6.939999999999875 | 2.818 |
| 6.944999999999875 | 2.819 |
| 6.949999999999874 | 2.82 |
| 6.954999999999874 | 2.82 |
| 6.959999999999874 | 2.821 |
| 6.964999999999874 | 2.822 |
| 6.969999999999874 | 2.823 |
| 6.974999999999874 | 2.824 |
| 6.979999999999874 | 2.825 |
| 6.984999999999874 | 2.826 |
| 6.989999999999874 | 2.827 |
| 6.994999999999874 | 2.828 |
| 6.999999999999873 | 2.828 |
| 7.004999999999874 | 2.829 |
| 7.009999999999873 | 2.83 |
| 7.014999999999874 | 2.831 |
| 7.019999999999873 | 2.832 |
| 7.024999999999873 | 2.833 |
| 7.029999999999873 | 2.834 |
| 7.034999999999873 | 2.835 |
| 7.039999999999873 | 2.835 |
| 7.044999999999873 | 2.836 |
| 7.049999999999872 | 2.837 |
| 7.054999999999873 | 2.838 |
| 7.059999999999872 | 2.839 |
| 7.064999999999872 | 2.84 |
| 7.069999999999872 | 2.841 |
| 7.074999999999872 | 2.842 |
| 7.079999999999872 | 2.843 |
| 7.084999999999872 | 2.843 |
| 7.089999999999871 | 2.844 |
| 7.094999999999872 | 2.845 |
| 7.099999999999871 | 2.846 |
| 7.104999999999872 | 2.847 |
| 7.109999999999871 | 2.848 |
| 7.114999999999871 | 2.849 |
| 7.119999999999871 | 2.85 |
| 7.124999999999871 | 2.85 |
| 7.129999999999871 | 2.851 |
| 7.134999999999871 | 2.852 |
| 7.13999999999987 | 2.853 |
| 7.144999999999871 | 2.854 |
| 7.14999999999987 | 2.855 |
| 7.154999999999871 | 2.856 |
| 7.15999999999987 | 2.857 |
| 7.16499999999987 | 2.857 |
| 7.16999999999987 | 2.858 |
| 7.17499999999987 | 2.859 |
| 7.17999999999987 | 2.86 |
| 7.18499999999987 | 2.861 |
| 7.18999999999987 | 2.862 |
| 7.19499999999987 | 2.863 |
| 7.19999999999987 | 2.864 |
| 7.20499999999987 | 2.864 |
| 7.20999999999987 | 2.865 |
| 7.21499999999987 | 2.866 |
| 7.21999999999987 | 2.867 |
| 7.22499999999987 | 2.868 |
| 7.229999999999868 | 2.869 |
| 7.234999999999868 | 2.87 |
| 7.239999999999868 | 2.871 |
| 7.244999999999868 | 2.871 |
| 7.249999999999868 | 2.872 |
| 7.254999999999868 | 2.873 |
| 7.259999999999868 | 2.874 |
| 7.264999999999868 | 2.875 |
| 7.269999999999868 | 2.876 |
| 7.274999999999867 | 2.877 |
| 7.279999999999867 | 2.877 |
| 7.284999999999867 | 2.878 |
| 7.289999999999867 | 2.879 |
| 7.294999999999867 | 2.88 |
| 7.299999999999867 | 2.881 |
| 7.304999999999867 | 2.882 |
| 7.309999999999867 | 2.883 |
| 7.314999999999867 | 2.884 |
| 7.319999999999867 | 2.884 |
| 7.324999999999867 | 2.885 |
| 7.329999999999866 | 2.886 |
| 7.334999999999866 | 2.887 |
| 7.339999999999866 | 2.888 |
| 7.344999999999866 | 2.889 |
| 7.349999999999866 | 2.89 |
| 7.354999999999866 | 2.891 |
| 7.359999999999866 | 2.891 |
| 7.364999999999866 | 2.892 |
| 7.369999999999865 | 2.893 |
| 7.374999999999865 | 2.894 |
| 7.379999999999865 | 2.895 |
| 7.384999999999865 | 2.896 |
| 7.389999999999865 | 2.897 |
| 7.394999999999865 | 2.897 |
| 7.399999999999865 | 2.898 |
| 7.404999999999865 | 2.899 |
| 7.409999999999865 | 2.9 |
| 7.414999999999865 | 2.901 |
| 7.419999999999864 | 2.902 |
| 7.424999999999864 | 2.903 |
| 7.429999999999864 | 2.903 |
| 7.434999999999864 | 2.904 |
| 7.439999999999864 | 2.905 |
| 7.444999999999864 | 2.906 |
| 7.449999999999864 | 2.907 |
| 7.454999999999864 | 2.908 |
| 7.459999999999864 | 2.909 |
| 7.464999999999864 | 2.909 |
| 7.469999999999863 | 2.91 |
| 7.474999999999863 | 2.911 |
| 7.479999999999863 | 2.912 |
| 7.484999999999863 | 2.913 |
| 7.489999999999863 | 2.914 |
| 7.494999999999863 | 2.915 |
| 7.499999999999863 | 2.915 |
| 7.504999999999863 | 2.916 |
| 7.509999999999863 | 2.917 |
| 7.514999999999863 | 2.918 |
| 7.519999999999862 | 2.919 |
| 7.524999999999863 | 2.92 |
| 7.529999999999862 | 2.921 |
| 7.534999999999862 | 2.921 |
| 7.539999999999862 | 2.922 |
| 7.544999999999862 | 2.923 |
| 7.549999999999862 | 2.924 |
| 7.554999999999862 | 2.925 |
| 7.559999999999861 | 2.926 |
| 7.564999999999862 | 2.927 |
| 7.569999999999861 | 2.927 |
| 7.574999999999861 | 2.928 |
| 7.57999999999986 | 2.929 |
| 7.584999999999861 | 2.93 |
| 7.58999999999986 | 2.931 |
| 7.594999999999861 | 2.932 |
| 7.59999999999986 | 2.933 |
| 7.604999999999861 | 2.933 |
| 7.60999999999986 | 2.934 |
| 7.614999999999861 | 2.935 |
| 7.61999999999986 | 2.936 |
| 7.62499999999986 | 2.937 |
| 7.62999999999986 | 2.938 |
| 7.63499999999986 | 2.939 |
| 7.63999999999986 | 2.939 |
| 7.64499999999986 | 2.94 |
| 7.64999999999986 | 2.941 |
| 7.65499999999986 | 2.942 |
| 7.65999999999986 | 2.943 |
| 7.66499999999986 | 2.944 |
| 7.669999999999859 | 2.944 |
| 7.674999999999859 | 2.945 |
| 7.67999999999986 | 2.946 |
| 7.684999999999859 | 2.947 |
| 7.68999999999986 | 2.948 |
| 7.694999999999859 | 2.949 |
| 7.699999999999859 | 2.95 |
| 7.704999999999859 | 2.95 |
| 7.709999999999858 | 2.951 |
| 7.714999999999859 | 2.952 |
| 7.719999999999858 | 2.953 |
| 7.724999999999858 | 2.954 |
| 7.729999999999858 | 2.955 |
| 7.734999999999858 | 2.956 |
| 7.739999999999858 | 2.956 |
| 7.744999999999858 | 2.957 |
| 7.749999999999857 | 2.958 |
| 7.754999999999858 | 2.959 |
| 7.759999999999857 | 2.96 |
| 7.764999999999857 | 2.961 |
| 7.769999999999857 | 2.961 |
| 7.774999999999857 | 2.962 |
| 7.779999999999857 | 2.963 |
| 7.784999999999857 | 2.964 |
| 7.789999999999856 | 2.965 |
| 7.794999999999857 | 2.966 |
| 7.799999999999856 | 2.966 |
| 7.804999999999857 | 2.967 |
| 7.809999999999856 | 2.968 |
| 7.814999999999856 | 2.969 |
| 7.819999999999856 | 2.97 |
| 7.824999999999856 | 2.971 |
| 7.829999999999856 | 2.972 |
| 7.834999999999856 | 2.972 |
| 7.839999999999855 | 2.973 |
| 7.844999999999856 | 2.974 |
| 7.849999999999855 | 2.975 |
| 7.854999999999856 | 2.976 |
| 7.859999999999855 | 2.977 |
| 7.864999999999855 | 2.977 |
| 7.869999999999855 | 2.978 |
| 7.874999999999855 | 2.979 |
| 7.879999999999855 | 2.98 |
| 7.884999999999855 | 2.981 |
| 7.889999999999854 | 2.982 |
| 7.894999999999855 | 2.982 |
| 7.899999999999854 | 2.983 |
| 7.904999999999854 | 2.984 |
| 7.909999999999854 | 2.985 |
| 7.914999999999854 | 2.986 |
| 7.919999999999854 | 2.987 |
| 7.924999999999854 | 2.987 |
| 7.929999999999854 | 2.988 |
| 7.934999999999854 | 2.989 |
| 7.939999999999853 | 2.99 |
| 7.944999999999854 | 2.991 |
| 7.949999999999853 | 2.992 |
| 7.954999999999853 | 2.992 |
| 7.959999999999853 | 2.993 |
| 7.964999999999853 | 2.994 |
| 7.969999999999853 | 2.995 |
| 7.974999999999853 | 2.996 |
| 7.979999999999852 | 2.997 |
| 7.984999999999853 | 2.997 |
| 7.989999999999852 | 2.998 |
| 7.994999999999853 | 2.999 |
| 7.999999999999852 | 3 |
| 8.004999999999853 | 3.001 |
| 8.009999999999854 | 3.002 |
| 8.014999999999855 | 3.002 |
| 8.019999999999856 | 3.003 |
| 8.024999999999856 | 3.004 |
| 8.029999999999857 | 3.005 |
| 8.034999999999858 | 3.006 |
| 8.039999999999859 | 3.007 |
| 8.04499999999986 | 3.007 |
| 8.04999999999986 | 3.008 |
| 8.05499999999986 | 3.009 |
| 8.05999999999986 | 3.01 |
| 8.064999999999863 | 3.011 |
| 8.069999999999864 | 3.012 |
| 8.074999999999864 | 3.012 |
| 8.079999999999865 | 3.013 |
| 8.084999999999866 | 3.014 |
| 8.089999999999867 | 3.015 |
| 8.094999999999867 | 3.016 |
| 8.099999999999868 | 3.017 |
| 8.104999999999867 | 3.017 |
| 8.10999999999987 | 3.018 |
| 8.11499999999987 | 3.019 |
| 8.119999999999871 | 3.02 |
| 8.124999999999872 | 3.021 |
| 8.129999999999873 | 3.022 |
| 8.134999999999874 | 3.022 |
| 8.139999999999874 | 3.023 |
| 8.144999999999875 | 3.024 |
| 8.149999999999876 | 3.025 |
| 8.154999999999877 | 3.026 |
| 8.159999999999878 | 3.027 |
| 8.164999999999878 | 3.027 |
| 8.16999999999988 | 3.028 |
| 8.17499999999988 | 3.029 |
| 8.17999999999988 | 3.03 |
| 8.184999999999881 | 3.031 |
| 8.189999999999882 | 3.032 |
| 8.194999999999883 | 3.032 |
| 8.199999999999884 | 3.033 |
| 8.204999999999885 | 3.034 |
| 8.209999999999885 | 3.035 |
| 8.214999999999886 | 3.036 |
| 8.219999999999887 | 3.036 |
| 8.224999999999888 | 3.037 |
| 8.229999999999889 | 3.038 |
| 8.23499999999989 | 3.039 |
| 8.23999999999989 | 3.04 |
| 8.24499999999989 | 3.041 |
| 8.249999999999892 | 3.041 |
| 8.254999999999892 | 3.042 |
| 8.259999999999893 | 3.043 |
| 8.264999999999892 | 3.044 |
| 8.269999999999895 | 3.045 |
| 8.274999999999896 | 3.045 |
| 8.279999999999896 | 3.046 |
| 8.284999999999897 | 3.047 |
| 8.289999999999896 | 3.048 |
| 8.294999999999899 | 3.049 |
| 8.2999999999999 | 3.05 |
| 8.3049999999999 | 3.05 |
| 8.3099999999999 | 3.051 |
| 8.3149999999999 | 3.052 |
| 8.3199999999999 | 3.053 |
| 8.324999999999903 | 3.054 |
| 8.329999999999904 | 3.055 |
| 8.334999999999903 | 3.055 |
| 8.339999999999906 | 3.056 |
| 8.344999999999906 | 3.057 |
| 8.349999999999907 | 3.058 |
| 8.354999999999908 | 3.059 |
| 8.359999999999909 | 3.059 |
| 8.36499999999991 | 3.06 |
| 8.36999999999991 | 3.061 |
| 8.37499999999991 | 3.062 |
| 8.37999999999991 | 3.063 |
| 8.38499999999991 | 3.063 |
| 8.38999999999991 | 3.064 |
| 8.394999999999914 | 3.065 |
| 8.399999999999915 | 3.066 |
| 8.404999999999916 | 3.067 |
| 8.409999999999917 | 3.068 |
| 8.414999999999917 | 3.068 |
| 8.419999999999918 | 3.069 |
| 8.424999999999917 | 3.07 |
| 8.42999999999992 | 3.071 |
| 8.43499999999992 | 3.072 |
| 8.43999999999992 | 3.072 |
| 8.444999999999922 | 3.073 |
| 8.449999999999921 | 3.074 |
| 8.454999999999924 | 3.075 |
| 8.459999999999924 | 3.076 |
| 8.464999999999925 | 3.077 |
| 8.469999999999924 | 3.077 |
| 8.474999999999927 | 3.078 |
| 8.479999999999928 | 3.079 |
| 8.484999999999928 | 3.08 |
| 8.48999999999993 | 3.081 |
| 8.49499999999993 | 3.081 |
| 8.49999999999993 | 3.082 |
| 8.50499999999993 | 3.083 |
| 8.50999999999993 | 3.084 |
| 8.514999999999933 | 3.085 |
| 8.519999999999934 | 3.085 |
| 8.524999999999935 | 3.086 |
| 8.529999999999935 | 3.087 |
| 8.534999999999936 | 3.088 |
| 8.539999999999935 | 3.089 |
| 8.544999999999938 | 3.089 |
| 8.549999999999939 | 3.09 |
| 8.55499999999994 | 3.091 |
| 8.55999999999994 | 3.092 |
| 8.56499999999994 | 3.093 |
| 8.56999999999994 | 3.094 |
| 8.57499999999994 | 3.094 |
| 8.57999999999994 | 3.095 |
| 8.584999999999942 | 3.096 |
| 8.589999999999945 | 3.097 |
| 8.594999999999946 | 3.098 |
| 8.599999999999946 | 3.098 |
| 8.604999999999947 | 3.099 |
| 8.609999999999946 | 3.1 |
| 8.614999999999949 | 3.101 |
| 8.61999999999995 | 3.102 |
| 8.62499999999995 | 3.102 |
| 8.62999999999995 | 3.103 |
| 8.634999999999952 | 3.104 |
| 8.639999999999953 | 3.105 |
| 8.644999999999953 | 3.106 |
| 8.649999999999954 | 3.106 |
| 8.654999999999953 | 3.107 |
| 8.659999999999956 | 3.108 |
| 8.664999999999957 | 3.109 |
| 8.669999999999957 | 3.11 |
| 8.674999999999956 | 3.11 |
| 8.679999999999959 | 3.111 |
| 8.68499999999996 | 3.112 |
| 8.68999999999996 | 3.113 |
| 8.69499999999996 | 3.114 |
| 8.69999999999996 | 3.114 |
| 8.704999999999963 | 3.115 |
| 8.709999999999964 | 3.116 |
| 8.714999999999964 | 3.117 |
| 8.719999999999965 | 3.118 |
| 8.724999999999964 | 3.118 |
| 8.729999999999967 | 3.119 |
| 8.734999999999967 | 3.12 |
| 8.739999999999968 | 3.121 |
| 8.744999999999967 | 3.122 |
| 8.74999999999997 | 3.122 |
| 8.75499999999997 | 3.123 |
| 8.75999999999997 | 3.124 |
| 8.764999999999972 | 3.125 |
| 8.769999999999971 | 3.126 |
| 8.774999999999974 | 3.126 |
| 8.779999999999974 | 3.127 |
| 8.784999999999975 | 3.128 |
| 8.789999999999974 | 3.129 |
| 8.794999999999977 | 3.13 |
| 8.799999999999978 | 3.13 |
| 8.804999999999978 | 3.131 |
| 8.80999999999998 | 3.132 |
| 8.81499999999998 | 3.133 |
| 8.81999999999998 | 3.134 |
| 8.82499999999998 | 3.134 |
| 8.82999999999998 | 3.135 |
| 8.834999999999983 | 3.136 |
| 8.839999999999984 | 3.137 |
| 8.844999999999985 | 3.138 |
| 8.849999999999985 | 3.138 |
| 8.854999999999986 | 3.139 |
| 8.859999999999985 | 3.14 |
| 8.864999999999988 | 3.141 |
| 8.869999999999989 | 3.142 |
| 8.87499999999999 | 3.142 |
| 8.87999999999999 | 3.143 |
| 8.88499999999999 | 3.144 |
| 8.88999999999999 | 3.145 |
| 8.89499999999999 | 3.146 |
| 8.89999999999999 | 3.146 |
| 8.904999999999994 | 3.147 |
| 8.909999999999995 | 3.148 |
| 8.914999999999996 | 3.149 |
| 8.919999999999996 | 3.15 |
| 8.924999999999997 | 3.15 |
| 8.929999999999996 | 3.151 |
| 8.934999999999999 | 3.152 |
| 8.94 | 3.153 |
| 8.945 | 3.154 |
| 8.95 | 3.154 |
| 8.955 | 3.155 |
| 8.960000000000003 | 3.156 |
| 8.965000000000003 | 3.157 |
| 8.970000000000004 | 3.158 |
| 8.975000000000003 | 3.158 |
| 8.980000000000006 | 3.159 |
| 8.985000000000007 | 3.16 |
| 8.990000000000007 | 3.161 |
| 8.995000000000008 | 3.161 |
| 9.000000000000009 | 3.162 |